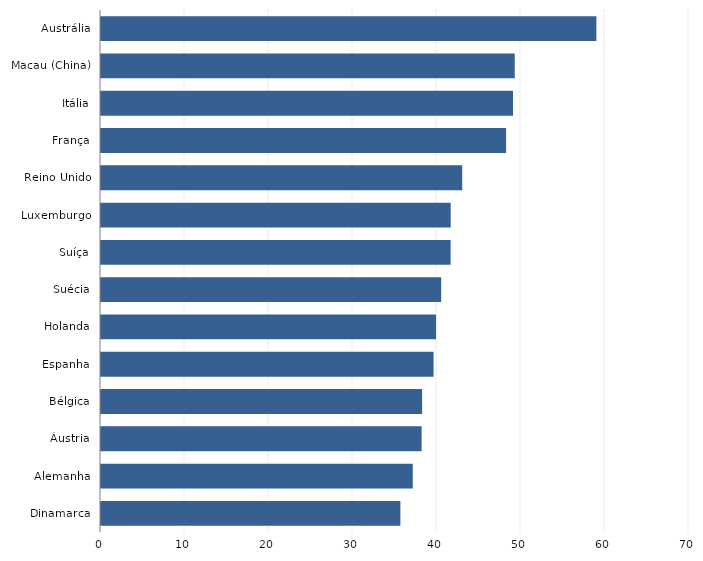
| Category | Series 0 |
|---|---|
| Dinamarca | 35.64 |
| Alemanha | 37.116 |
| Áustria | 38.169 |
| Bélgica | 38.227 |
| Espanha | 39.592 |
| Holanda | 39.886 |
| Suécia | 40.498 |
| Suíça | 41.62 |
| Luxemburgo | 41.631 |
| Reino Unido | 43.001 |
| França | 48.227 |
| Itália | 49.053 |
| Macau (China) | 49.254 |
| Austrália | 58.974 |